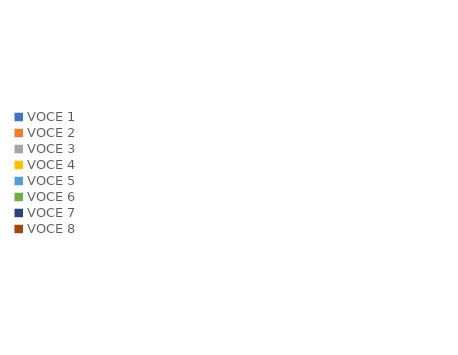
| Category | Series 0 | Series 1 |
|---|---|---|
| VOCE 1 | 0 | 0 |
| VOCE 2 | 0 | 0 |
| VOCE 3 | 0 | 0 |
| VOCE 4 | 0 | 0 |
| VOCE 5 | 0 | 0 |
| VOCE 6 | 0 | 0 |
| VOCE 7 | 0 | 0 |
| VOCE 8 | 0 | 0 |